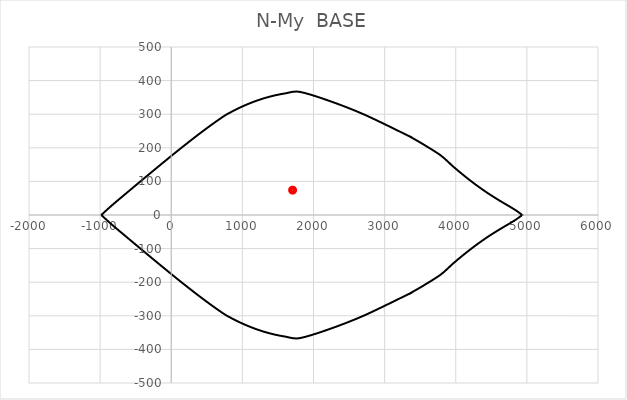
| Category | Series 2 |
|---|---|
| 1706.0 | 74 |